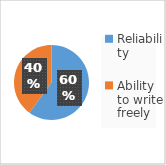
| Category | Series 0 |
|---|---|
| Reliability | 3 |
| Ability to write freely | 2 |